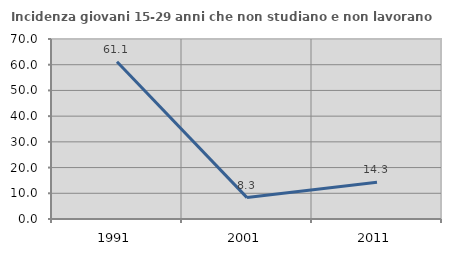
| Category | Incidenza giovani 15-29 anni che non studiano e non lavorano  |
|---|---|
| 1991.0 | 61.123 |
| 2001.0 | 8.323 |
| 2011.0 | 14.316 |